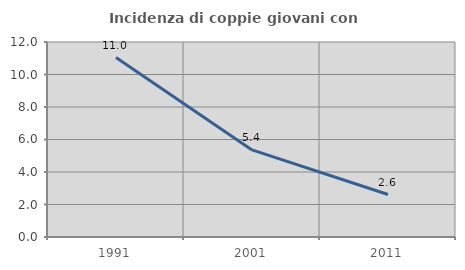
| Category | Incidenza di coppie giovani con figli |
|---|---|
| 1991.0 | 11.043 |
| 2001.0 | 5.357 |
| 2011.0 | 2.614 |